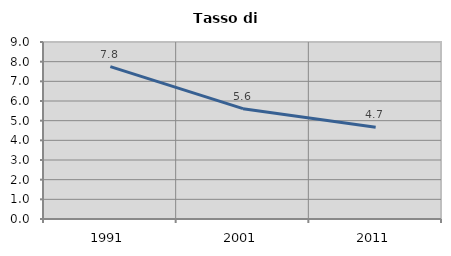
| Category | Tasso di disoccupazione   |
|---|---|
| 1991.0 | 7.75 |
| 2001.0 | 5.611 |
| 2011.0 | 4.662 |